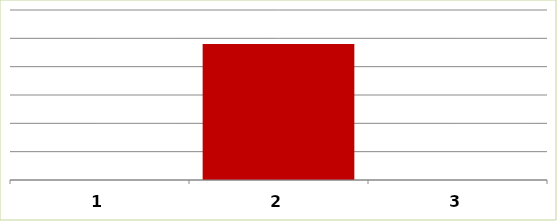
| Category | Series 0 |
|---|---|
| 0 | 0 |
| 1 | 960000 |
| 2 | 0 |